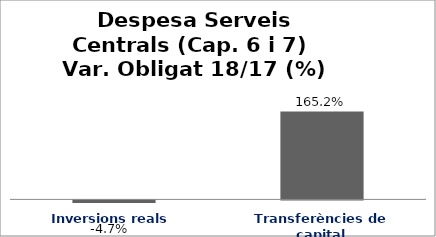
| Category | Series 0 |
|---|---|
| Inversions reals | -0.047 |
| Transferències de capital | 1.652 |